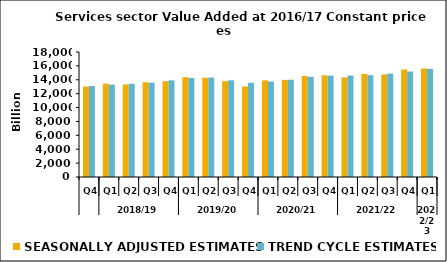
| Category | SEASONALLY ADJUSTED ESTIMATES | TREND CYCLE ESTIMATES |
|---|---|---|
| 0 | 13020.098 | 13099.353 |
| 1 | 13440.396 | 13291.475 |
| 2 | 13325.306 | 13423.734 |
| 3 | 13630.938 | 13573.588 |
| 4 | 13797.124 | 13915.058 |
| 5 | 14368.967 | 14260.056 |
| 6 | 14297.429 | 14316.998 |
| 7 | 13804.281 | 13925.099 |
| 8 | 13026.982 | 13570.923 |
| 9 | 13906.988 | 13744.064 |
| 10 | 13984.285 | 14008.793 |
| 11 | 14538.42 | 14430.584 |
| 12 | 14654.154 | 14602.445 |
| 13 | 14332.718 | 14606.483 |
| 14 | 14836.04 | 14671.071 |
| 15 | 14764.57 | 14880.637 |
| 16 | 15481.73 | 15192.085 |
| 17 | 15624.853 | 15565.142 |